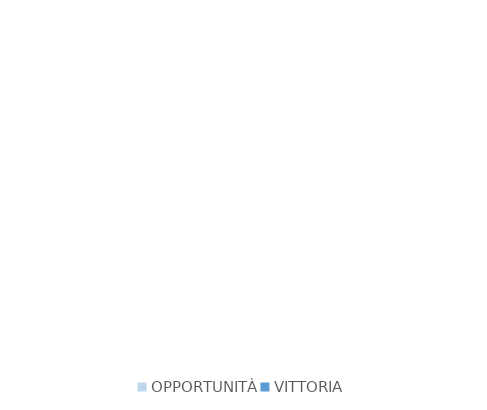
| Category | Series 0 |
|---|---|
| OPPORTUNITÀ | 0 |
| VITTORIA | 0 |